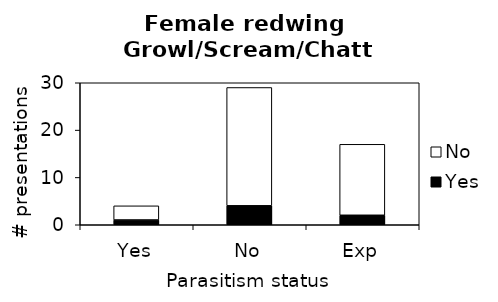
| Category | Yes | No |
|---|---|---|
| Yes | 1 | 3 |
| No | 4 | 25 |
| Exp | 2 | 15 |